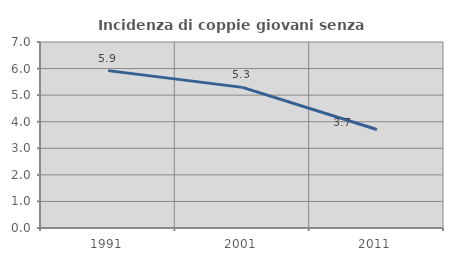
| Category | Incidenza di coppie giovani senza figli |
|---|---|
| 1991.0 | 5.922 |
| 2001.0 | 5.292 |
| 2011.0 | 3.708 |